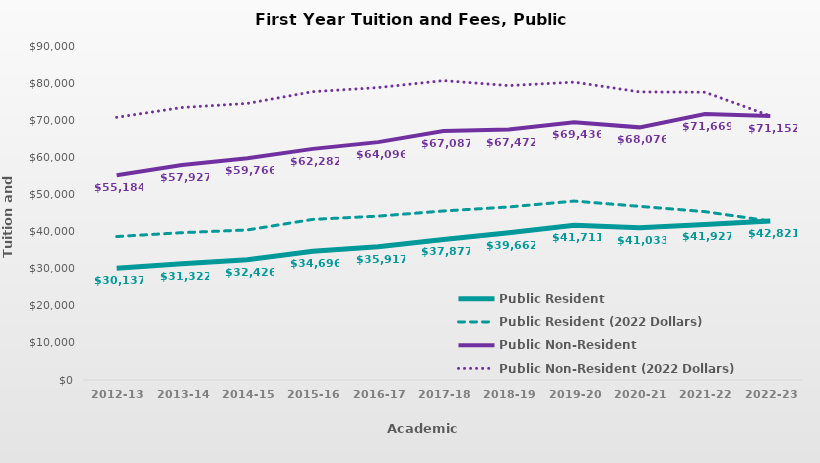
| Category | Public Resident | Public Resident (2022 Dollars) | Public Non-Resident | Public Non-Resident (2022 Dollars) |
|---|---|---|---|---|
| 2012-13 | 30136.816 | 38654.42 | 55184.211 | 70780.28 |
| 2013-14 | 31322.41 | 39703.86 | 57927.077 | 73428.45 |
| 2014-15 | 32426.179 | 40432.95 | 59766.462 | 74524.02 |
| 2015-16 | 34695.564 | 43279.12 | 62281.846 | 77689.36 |
| 2016-17 | 35916.949 | 44155.83 | 64096.231 | 78798.67 |
| 2017-18 | 37877.205 | 45548.34 | 67086.744 | 80674.33 |
| 2018-19 | 39661.923 | 46633.04 | 67471.667 | 79330.96 |
| 2019-20 | 41711.282 | 48217.04 | 69436.026 | 80266.55 |
| 2020-21 | 41032.692 | 46791.62 | 68076.128 | 77629.87 |
| 2021-22 | 41927.375 | 45365.71 | 71669.075 | 77547.05 |
| 2022-23 | 42821 | 42821 | 71152 | 71152 |